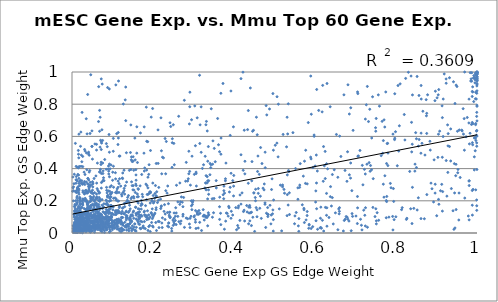
| Category | Series 0 |
|---|---|
| 0.718357 | 0.299 |
| 0.285556 | 0.323 |
| 0.155029 | 0.056 |
| 0.94191 | 0.939 |
| 0.474218 | 0.268 |
| 0.679518 | 0.098 |
| 0.994989 | 0.593 |
| 0.901487 | 0.84 |
| 0.110698 | 0.128 |
| 0.07789 | 0.343 |
| 0.333953 | 0.634 |
| 0.0120055 | 0.251 |
| 0.0165022 | 0.409 |
| 0.683924 | 0.074 |
| 0.888867 | 0.275 |
| 0.269317 | 0.074 |
| 0.150832 | 0.129 |
| 0.521332 | 0.612 |
| 0.196581 | 0.065 |
| 0.75157 | 0.076 |
| 0.637877 | 0.226 |
| 0.175998 | 0.043 |
| 0.660283 | 0.135 |
| 0.0950655 | 0.097 |
| 0.988347 | 0.264 |
| 0.483557 | 0.102 |
| 0.861981 | 0.916 |
| 0.060758 | 0.044 |
| 0.514572 | 0.297 |
| 0.0789242 | 0.045 |
| 0.996859 | 0.268 |
| 0.282066 | 0.093 |
| 0.999918 | 0.395 |
| 0.848596 | 0.623 |
| 0.0527951 | 0.046 |
| 0.337095 | 0.268 |
| 0.143686 | 0.15 |
| 0.144068 | 0.092 |
| 0.199073 | 0.773 |
| 0.549527 | 0.057 |
| 0.212938 | 0.072 |
| 0.572661 | 0.153 |
| 0.201103 | 0.186 |
| 0.313554 | 0.139 |
| 0.0573692 | 0.182 |
| 0.0279317 | 0.024 |
| 0.529778 | 0.535 |
| 0.517628 | 0.013 |
| 0.432492 | 0.131 |
| 0.0153344 | 0.055 |
| 0.625758 | 0.159 |
| 0.531065 | 0.108 |
| 0.0605387 | 0.103 |
| 0.443017 | 0.046 |
| 0.0858762 | 0.019 |
| 0.0252657 | 0.022 |
| 0.0222175 | 0.021 |
| 0.0837457 | 0.038 |
| 0.414497 | 0.078 |
| 0.423444 | 0.133 |
| 0.96833 | 0.71 |
| 0.0822502 | 0.039 |
| 0.09217 | 0.895 |
| 0.141815 | 0.137 |
| 0.234822 | 0.247 |
| 0.11498 | 0.199 |
| 0.141614 | 0.389 |
| 0.0581019 | 0.036 |
| 0.133703 | 0.035 |
| 0.0196944 | 0.014 |
| 0.0957484 | 0.202 |
| 0.0468442 | 0.026 |
| 0.0160687 | 0.489 |
| 0.0659149 | 0.909 |
| 0.181001 | 0.027 |
| 0.0706342 | 0.08 |
| 0.0345382 | 0.007 |
| 0.114906 | 0.944 |
| 0.155152 | 0.056 |
| 0.0438015 | 0.05 |
| 0.158073 | 0.121 |
| 0.0207399 | 0.11 |
| 0.109202 | 0.139 |
| 0.114537 | 0.59 |
| 0.0153444 | 0.066 |
| 0.117055 | 0.076 |
| 0.0210749 | 0.053 |
| 0.120328 | 0.291 |
| 0.343898 | 0.772 |
| 0.0160836 | 0.166 |
| 0.00742404 | 0.055 |
| 0.0233189 | 0.074 |
| 0.0383991 | 0.147 |
| 0.0199004 | 0.097 |
| 0.417271 | 0.486 |
| 0.232929 | 0.568 |
| 0.173498 | 0.24 |
| 0.0481266 | 0.221 |
| 0.116635 | 0.477 |
| 0.786092 | 0.308 |
| 0.0465272 | 0.206 |
| 0.27743 | 0.824 |
| 0.0352039 | 0.71 |
| 0.0249195 | 0.749 |
| 0.325787 | 0.111 |
| 0.951757 | 0.632 |
| 0.676875 | 0.102 |
| 0.0191285 | 0.295 |
| 0.0322849 | 0.509 |
| 0.289801 | 0.677 |
| 0.319936 | 0.016 |
| 0.0190005 | 0.04 |
| 0.236062 | 0.043 |
| 0.168207 | 0.293 |
| 0.0260575 | 0.077 |
| 0.6003 | 0.416 |
| 0.130739 | 0.04 |
| 0.314993 | 0.98 |
| 0.536633 | 0.25 |
| 0.568685 | 0.175 |
| 0.0700549 | 0.038 |
| 0.0309574 | 0.114 |
| 0.0722578 | 0.957 |
| 0.0693182 | 0.117 |
| 0.0136864 | 0.051 |
| 0.0696079 | 0.07 |
| 0.0482181 | 0.069 |
| 0.0118453 | 0.187 |
| 0.152051 | 0.136 |
| 0.167323 | 0.095 |
| 0.726782 | 0.796 |
| 0.0376793 | 0.101 |
| 0.0372241 | 0.02 |
| 0.493965 | 0.336 |
| 0.399084 | 0.291 |
| 0.145627 | 0.112 |
| 0.704594 | 0.059 |
| 0.840585 | 0.284 |
| 0.335006 | 0.045 |
| 0.0843456 | 0.396 |
| 0.604038 | 0.151 |
| 0.312608 | 0.116 |
| 0.0368721 | 0.078 |
| 0.681427 | 0.921 |
| 0.0508171 | 0.303 |
| 0.602584 | 0.076 |
| 0.0850064 | 0.099 |
| 0.705829 | 0.477 |
| 0.57118 | 0.353 |
| 0.808306 | 0.666 |
| 0.0705671 | 0.07 |
| 0.0232542 | 0.016 |
| 0.705768 | 0.866 |
| 0.597916 | 0.6 |
| 0.733568 | 0.437 |
| 0.53548 | 0.381 |
| 0.0891933 | 0.397 |
| 0.223292 | 0.094 |
| 0.580521 | 0.108 |
| 0.550494 | 0.106 |
| 0.0181383 | 0.041 |
| 0.315555 | 0.556 |
| 0.0463404 | 0.983 |
| 0.803249 | 0.418 |
| 0.0466587 | 0.296 |
| 0.364445 | 0.084 |
| 0.680432 | 0.504 |
| 0.116857 | 0.157 |
| 0.100539 | 0.378 |
| 0.128543 | 0.39 |
| 0.022665 | 0.131 |
| 0.012778 | 0.228 |
| 0.0418495 | 0.148 |
| 0.0871548 | 0.536 |
| 0.0176795 | 0.095 |
| 0.0101371 | 0.331 |
| 0.0856256 | 0.09 |
| 0.187494 | 0.28 |
| 0.0681547 | 0.251 |
| 0.0124649 | 0.052 |
| 0.969517 | 1 |
| 0.113535 | 0.55 |
| 0.0681806 | 0.632 |
| 0.178704 | 0.071 |
| 0.748192 | 0.102 |
| 0.0525424 | 0.039 |
| 0.0702964 | 0.015 |
| 0.422176 | 0.999 |
| 0.018036 | 0.011 |
| 0.0679802 | 0.378 |
| 0.101214 | 0.049 |
| 0.0896006 | 0.058 |
| 0.0225988 | 0.052 |
| 0.111407 | 0.049 |
| 0.0147012 | 0.074 |
| 0.0400479 | 0.129 |
| 0.0742723 | 0.077 |
| 0.0187522 | 0.041 |
| 0.139893 | 0.041 |
| 0.0211039 | 0.132 |
| 0.110488 | 0.064 |
| 0.094565 | 0.151 |
| 0.10492 | 0.029 |
| 0.0383495 | 0.038 |
| 0.0439104 | 0.153 |
| 0.0262996 | 0.043 |
| 0.0108756 | 0.043 |
| 0.105053 | 0.063 |
| 0.12918 | 0.119 |
| 0.0358865 | 0.09 |
| 0.033009 | 0.021 |
| 0.0545646 | 0.033 |
| 0.125645 | 0.059 |
| 0.0913621 | 0.134 |
| 0.197229 | 0.204 |
| 0.0856379 | 0.265 |
| 0.0629213 | 0.051 |
| 0.0462658 | 0.022 |
| 0.0591831 | 0.097 |
| 0.0870486 | 0.133 |
| 0.55784 | 0.209 |
| 0.198433 | 0.089 |
| 0.221934 | 0.062 |
| 0.120658 | 0.079 |
| 0.0503294 | 0.036 |
| 0.0932733 | 0.023 |
| 0.150976 | 0.473 |
| 0.166281 | 0.091 |
| 0.125929 | 0.252 |
| 0.161572 | 0.438 |
| 0.126058 | 0.048 |
| 0.0274446 | 0.073 |
| 0.0924494 | 0.428 |
| 0.411243 | 0.168 |
| 0.197301 | 0.197 |
| 0.439124 | 0.075 |
| 0.0700726 | 0.396 |
| 0.273901 | 0.105 |
| 0.30215 | 0.364 |
| 0.274168 | 0.116 |
| 0.166722 | 0.131 |
| 0.53701 | 0.115 |
| 0.923946 | 0.45 |
| 0.0377976 | 0.037 |
| 0.0284928 | 0.091 |
| 0.776772 | 0.432 |
| 0.174409 | 0.036 |
| 0.82044 | 0.736 |
| 0.0521454 | 0.035 |
| 0.167081 | 0.053 |
| 0.775905 | 0.095 |
| 0.113391 | 0.136 |
| 0.0213719 | 0.004 |
| 0.0993862 | 0.122 |
| 0.156346 | 0.252 |
| 0.999163 | 0.205 |
| 0.238074 | 0.182 |
| 0.398602 | 0.659 |
| 0.638395 | 0.288 |
| 0.825694 | 0.084 |
| 0.999379 | 0.169 |
| 0.670074 | 0.012 |
| 0.981042 | 0.324 |
| 0.480978 | 0.733 |
| 0.99989 | 0.794 |
| 0.43532 | 0.309 |
| 0.988663 | 0.111 |
| 0.193111 | 0.009 |
| 0.72301 | 0.11 |
| 0.855196 | 0.219 |
| 0.90352 | 0.47 |
| 0.756341 | 0.858 |
| 0.684908 | 0.361 |
| 0.973003 | 0.598 |
| 0.989307 | 0.548 |
| 0.585557 | 0.049 |
| 0.980014 | 0.323 |
| 0.038201 | 0.025 |
| 0.0584004 | 0.138 |
| 0.594336 | 0.039 |
| 0.133495 | 0.11 |
| 0.0330171 | 0.13 |
| 0.614403 | 0.161 |
| 0.138823 | 0.053 |
| 0.0905877 | 0.07 |
| 0.177713 | 0.496 |
| 0.857122 | 0.581 |
| 0.072196 | 0.113 |
| 0.330093 | 0.106 |
| 0.128755 | 0.262 |
| 0.0522356 | 0.074 |
| 0.0584545 | 0.083 |
| 0.457057 | 0.144 |
| 0.621135 | 0.537 |
| 0.124454 | 0.154 |
| 0.850452 | 0.407 |
| 0.18346 | 0.782 |
| 0.714606 | 0.048 |
| 0.137326 | 0.221 |
| 0.804975 | 0.916 |
| 0.506313 | 0.846 |
| 0.687748 | 0.341 |
| 0.574095 | 0.446 |
| 0.69102 | 0.263 |
| 0.309129 | 0.126 |
| 0.334107 | 0.312 |
| 0.0292313 | 0.051 |
| 0.111092 | 0.078 |
| 0.904274 | 0.858 |
| 0.292391 | 0.297 |
| 0.337602 | 0.325 |
| 0.272274 | 0.191 |
| 0.583426 | 0.686 |
| 0.71246 | 0.085 |
| 0.0591122 | 0.107 |
| 0.166717 | 0.112 |
| 0.962411 | 0.639 |
| 0.928381 | 0.541 |
| 0.425002 | 0.142 |
| 0.945716 | 0.804 |
| 0.142605 | 0.057 |
| 0.22847 | 0.176 |
| 0.0458777 | 0.066 |
| 0.297629 | 0.191 |
| 0.22016 | 0.163 |
| 0.98841 | 0.173 |
| 0.778189 | 0.556 |
| 0.387912 | 0.157 |
| 0.838799 | 0.504 |
| 0.390629 | 0.283 |
| 0.107161 | 0.374 |
| 0.242008 | 0.684 |
| 0.0221483 | 0.049 |
| 0.659693 | 0.119 |
| 0.190363 | 0.424 |
| 0.602073 | 0.261 |
| 0.337894 | 0.114 |
| 0.42534 | 0.638 |
| 0.165226 | 0.128 |
| 0.0149119 | 0.154 |
| 0.107183 | 0.137 |
| 0.336688 | 0.537 |
| 0.0666712 | 0.247 |
| 0.0319926 | 0.024 |
| 0.0930773 | 0.259 |
| 0.164657 | 0.056 |
| 0.0511316 | 0.179 |
| 0.0635012 | 0.103 |
| 0.019651 | 0.081 |
| 0.0574801 | 0.176 |
| 0.056643 | 0.026 |
| 0.0182736 | 0.079 |
| 0.426997 | 0.446 |
| 0.0480423 | 0.01 |
| 0.0317637 | 0.027 |
| 0.090616 | 0.384 |
| 0.874517 | 0.828 |
| 0.749595 | 0.654 |
| 0.152994 | 0.217 |
| 0.422767 | 0.389 |
| 0.109243 | 0.116 |
| 0.20055 | 0.233 |
| 0.124092 | 0.134 |
| 0.15244 | 0.091 |
| 0.390682 | 0.606 |
| 0.0553856 | 0.196 |
| 0.287095 | 0.337 |
| 0.148458 | 0.114 |
| 0.150987 | 0.446 |
| 0.0642308 | 0.062 |
| 0.0724478 | 0.279 |
| 0.0370698 | 0.028 |
| 0.0235357 | 0.049 |
| 0.0600038 | 0.217 |
| 0.0422625 | 0.28 |
| 0.00875941 | 0.258 |
| 0.0202835 | 0.178 |
| 0.0922949 | 0.502 |
| 0.0258915 | 0.098 |
| 0.0621678 | 0.051 |
| 0.0187486 | 0.32 |
| 0.0434104 | 0.287 |
| 0.0290432 | 0.31 |
| 0.0219038 | 0.627 |
| 0.0298475 | 0.152 |
| 0.0185486 | 0.123 |
| 0.0155305 | 0.02 |
| 0.00836883 | 0.557 |
| 0.178905 | 0.135 |
| 0.0350686 | 0.021 |
| 0.00313033 | 0.012 |
| 0.409005 | 0.047 |
| 0.99999 | 0.922 |
| 0.705156 | 0.156 |
| 0.642772 | 0.22 |
| 0.189449 | 0.364 |
| 0.948458 | 0.146 |
| 0.0229426 | 0.006 |
| 0.107544 | 0.128 |
| 0.496988 | 0.012 |
| 0.0654882 | 0.045 |
| 0.128297 | 0.02 |
| 1.0 | 0.97 |
| 0.113653 | 0.283 |
| 0.995609 | 0.511 |
| 0.0475176 | 0.074 |
| 1.0 | 0.696 |
| 0.172926 | 0.069 |
| 0.0987624 | 0.252 |
| 0.0193539 | 0.021 |
| 0.160225 | 0.082 |
| 0.0809594 | 0.036 |
| 0.004848 | 0.003 |
| 0.0260537 | 0.081 |
| 0.188661 | 0.088 |
| 0.0532216 | 0.042 |
| 0.00544776 | 0.017 |
| 0.065879 | 0.256 |
| 0.291099 | 0.875 |
| 0.00724447 | 0.06 |
| 0.0328903 | 0.023 |
| 0.013506 | 0.031 |
| 0.117464 | 0.014 |
| 0.024043 | 0.072 |
| 0.0251224 | 0.03 |
| 0.0160722 | 0.028 |
| 0.0923221 | 0.004 |
| 0.0330893 | 0.024 |
| 0.0235889 | 0.047 |
| 0.0373617 | 0.046 |
| 0.0226899 | 0.117 |
| 0.928856 | 0.617 |
| 0.0605936 | 0.551 |
| 0.0175206 | 0.241 |
| 0.100987 | 0.144 |
| 0.989866 | 0.678 |
| 0.117422 | 0.337 |
| 0.0776009 | 0.163 |
| 0.207924 | 0.432 |
| 0.492768 | 0.27 |
| 0.201311 | 0.108 |
| 0.0220259 | 0.155 |
| 0.15999 | 0.496 |
| 0.0371947 | 0.042 |
| 0.0548928 | 0.052 |
| 0.0299016 | 0.378 |
| 0.00728444 | 0.055 |
| 0.28061 | 0.322 |
| 0.10746 | 0.251 |
| 0.321984 | 0.401 |
| 0.0480868 | 0.257 |
| 0.163812 | 0.226 |
| 0.0691385 | 0.029 |
| 0.381183 | 0.124 |
| 0.168098 | 0.03 |
| 0.137462 | 0.197 |
| 0.15816 | 0.012 |
| 0.121029 | 0.006 |
| 0.0926403 | 0.037 |
| 0.0263363 | 0.302 |
| 0.0719615 | 0.44 |
| 0.108238 | 0.92 |
| 0.198015 | 0.112 |
| 0.111261 | 0.024 |
| 0.0616088 | 0.03 |
| 0.0337606 | 0.037 |
| 0.0279446 | 0.059 |
| 0.0318437 | 0.038 |
| 0.0184565 | 0.031 |
| 0.0164582 | 0.041 |
| 0.0118417 | 0.029 |
| 0.0699236 | 0.023 |
| 0.0675765 | 0.032 |
| 0.073409 | 0.03 |
| 0.0393377 | 0.338 |
| 0.0840835 | 0.07 |
| 0.0363018 | 0.152 |
| 0.0707856 | 0.115 |
| 0.0822908 | 0.092 |
| 0.041819 | 0.272 |
| 0.230094 | 0.118 |
| 0.0370766 | 0.06 |
| 0.0922987 | 0.036 |
| 0.035196 | 0.021 |
| 0.0373944 | 0.195 |
| 0.0368484 | 0.024 |
| 0.84401 | 0.153 |
| 0.0398237 | 0.122 |
| 0.968893 | 0.514 |
| 0.0921424 | 0.08 |
| 0.742144 | 0.846 |
| 0.996684 | 0.875 |
| 0.0546568 | 0.117 |
| 0.871583 | 0.484 |
| 0.157416 | 0.16 |
| 0.207528 | 0.145 |
| 0.0639192 | 0.065 |
| 0.252708 | 0.057 |
| 0.979956 | 0.684 |
| 0.855279 | 0.54 |
| 0.0570127 | 0.034 |
| 0.00614132 | 0.057 |
| 0.0956843 | 0.124 |
| 0.0189712 | 0.05 |
| 0.0120591 | 0.103 |
| 0.0452104 | 0.038 |
| 0.135016 | 0.018 |
| 0.121112 | 0.025 |
| 0.158357 | 0.088 |
| 0.153035 | 0.266 |
| 0.0337317 | 0.051 |
| 0.0230631 | 0.019 |
| 0.0618924 | 0.041 |
| 0.186018 | 0.097 |
| 0.00887429 | 0.01 |
| 0.0290007 | 0.116 |
| 0.074817 | 0.028 |
| 0.0402795 | 0.035 |
| 0.132847 | 0.187 |
| 0.206804 | 0.065 |
| 0.00645589 | 0.014 |
| 0.020534 | 0.149 |
| 0.0134809 | 0.204 |
| 0.0363262 | 0.107 |
| 0.0134591 | 0.037 |
| 0.0517626 | 0.172 |
| 0.0980891 | 0.1 |
| 0.0558845 | 0.069 |
| 0.0380486 | 0.118 |
| 0.177892 | 0.13 |
| 0.0175424 | 0.026 |
| 0.00980263 | 0.046 |
| 0.0236384 | 0.087 |
| 0.00397577 | 0.019 |
| 0.0061991 | 0.065 |
| 0.0088116 | 0.082 |
| 0.0106938 | 0.04 |
| 0.0336461 | 0.057 |
| 0.0384085 | 0.058 |
| 0.0110796 | 0.044 |
| 0.00576948 | 0.105 |
| 0.0611379 | 0.046 |
| 0.0506045 | 0.042 |
| 0.0719844 | 0.025 |
| 0.00523145 | 0.027 |
| 0.195928 | 0.122 |
| 0.0523021 | 0.055 |
| 0.0596102 | 0.093 |
| 0.0156793 | 0.513 |
| 0.277675 | 0.035 |
| 0.0288302 | 0.01 |
| 0.0270271 | 0.01 |
| 0.0978777 | 0.099 |
| 0.0683133 | 0.146 |
| 0.0459034 | 0.021 |
| 0.143415 | 0.077 |
| 0.0206203 | 0.131 |
| 0.0726655 | 0.313 |
| 0.040276 | 0.039 |
| 0.098396 | 0.077 |
| 0.367524 | 0.052 |
| 0.0108307 | 0.33 |
| 0.14672 | 0.078 |
| 0.036813 | 0.042 |
| 0.0747737 | 0.041 |
| 0.0196605 | 0.217 |
| 0.0236146 | 0.16 |
| 0.0179074 | 0.056 |
| 0.0399844 | 0.066 |
| 0.0804127 | 0.041 |
| 0.0656093 | 0.038 |
| 0.109357 | 0.135 |
| 0.0405566 | 0.105 |
| 0.0385126 | 0.023 |
| 0.054549 | 0.339 |
| 0.13465 | 0.099 |
| 0.124933 | 0.338 |
| 0.122376 | 0.24 |
| 0.43858 | 0.171 |
| 0.0901662 | 0.416 |
| 0.273947 | 0.163 |
| 0.701226 | 0.105 |
| 0.0623707 | 0.067 |
| 0.0131994 | 0.28 |
| 0.239013 | 0.062 |
| 0.0204833 | 0.176 |
| 0.105714 | 0.078 |
| 0.452602 | 0.22 |
| 0.836231 | 0.151 |
| 0.0226294 | 0.062 |
| 0.161074 | 0.196 |
| 0.305014 | 0.139 |
| 0.0387454 | 0.176 |
| 0.589547 | 0.975 |
| 0.379472 | 0.074 |
| 0.130212 | 0.164 |
| 0.737211 | 0.419 |
| 0.376612 | 0.248 |
| 0.185258 | 0.295 |
| 0.531661 | 0.361 |
| 0.141747 | 0.191 |
| 0.247636 | 0.561 |
| 0.0484678 | 0.041 |
| 0.0167652 | 0.264 |
| 0.00736248 | 0.036 |
| 0.0219418 | 0.095 |
| 0.0216522 | 0.027 |
| 0.107063 | 0.057 |
| 0.00753605 | 0.057 |
| 0.015198 | 0.288 |
| 0.0977996 | 0.112 |
| 0.0191938 | 0.055 |
| 0.0167608 | 0.467 |
| 0.0538776 | 0.07 |
| 0.0110527 | 0.065 |
| 0.0177158 | 0.13 |
| 0.0182761 | 0.046 |
| 0.0533476 | 0.098 |
| 0.0758922 | 0.065 |
| 0.0424399 | 0.378 |
| 0.0200409 | 0.184 |
| 0.0317875 | 0.302 |
| 0.0333483 | 0.115 |
| 0.00828313 | 0.02 |
| 0.0149492 | 0.135 |
| 0.0150583 | 0.034 |
| 0.173181 | 0.178 |
| 0.117179 | 0.131 |
| 0.0211326 | 0.072 |
| 0.0523996 | 0.1 |
| 0.0413371 | 0.098 |
| 0.0781463 | 0.071 |
| 0.0921525 | 0.081 |
| 0.0762764 | 0.37 |
| 0.255319 | 0.104 |
| 0.195667 | 0.126 |
| 0.0700316 | 0.118 |
| 0.0734983 | 0.107 |
| 0.443843 | 0.324 |
| 0.040067 | 0.154 |
| 0.0440704 | 0.091 |
| 0.417263 | 0.179 |
| 0.4396 | 0.159 |
| 0.0943499 | 0.01 |
| 0.0490169 | 0.09 |
| 0.242555 | 0.099 |
| 0.0724209 | 0.37 |
| 0.139368 | 0.128 |
| 0.0123547 | 0.004 |
| 0.0159963 | 0.046 |
| 0.0835936 | 0.031 |
| 0.435403 | 0.761 |
| 0.822004 | 0.578 |
| 0.0725491 | 0.116 |
| 0.00714861 | 0.177 |
| 0.625059 | 0.507 |
| 0.806792 | 0.509 |
| 0.0841138 | 0.063 |
| 0.772363 | 0.658 |
| 0.165706 | 0.148 |
| 0.0877426 | 0.098 |
| 0.729487 | 0.036 |
| 0.44319 | 0.129 |
| 0.605799 | 0.385 |
| 0.147382 | 0.014 |
| 0.290833 | 0.784 |
| 0.553632 | 0.127 |
| 0.0837369 | 0.129 |
| 0.999955 | 0.956 |
| 0.0767646 | 0.132 |
| 0.440966 | 0.126 |
| 0.383206 | 0.122 |
| 0.948501 | 0.918 |
| 0.8466 | 0.384 |
| 0.999392 | 0.981 |
| 0.351285 | 0.526 |
| 0.508885 | 0.473 |
| 0.656414 | 0.346 |
| 0.113751 | 0.323 |
| 0.0608416 | 0.181 |
| 0.102566 | 0.215 |
| 0.437339 | 0.124 |
| 0.0907006 | 0.145 |
| 0.0821823 | 0.09 |
| 0.981312 | 0.553 |
| 0.275646 | 0.221 |
| 0.87004 | 0.088 |
| 0.229894 | 0.587 |
| 0.459959 | 0.246 |
| 0.0394409 | 0.256 |
| 0.603695 | 0.311 |
| 0.585559 | 0.053 |
| 0.672236 | 0.078 |
| 0.852296 | 0.143 |
| 0.460079 | 0.276 |
| 0.308929 | 0.116 |
| 0.240093 | 0.111 |
| 0.791708 | 0.103 |
| 0.304714 | 0.542 |
| 0.0478347 | 0.036 |
| 0.0251958 | 0.115 |
| 0.0818194 | 0.12 |
| 0.0384946 | 0.248 |
| 0.0693534 | 0.533 |
| 0.186378 | 0.138 |
| 0.254967 | 0.078 |
| 0.161708 | 0.127 |
| 0.122709 | 0.121 |
| 0.0944957 | 0.223 |
| 0.145881 | 0.213 |
| 0.14868 | 0.446 |
| 0.267972 | 0.193 |
| 0.020729 | 0.056 |
| 0.111615 | 0.072 |
| 0.0359935 | 0.055 |
| 0.410549 | 0.156 |
| 0.155855 | 0.015 |
| 0.0910851 | 0.086 |
| 0.0723583 | 0.067 |
| 0.184662 | 0.108 |
| 0.0500671 | 0.061 |
| 0.0155442 | 0.044 |
| 0.00568655 | 0.015 |
| 0.0166314 | 0.058 |
| 0.0516844 | 0.102 |
| 0.140459 | 0.013 |
| 0.0900105 | 0.1 |
| 0.00886976 | 0.171 |
| 0.0305544 | 0.024 |
| 0.0997282 | 0.02 |
| 0.0255035 | 0.107 |
| 0.0947624 | 0.097 |
| 0.00941241 | 0.014 |
| 0.0484357 | 0.104 |
| 0.0515653 | 0.105 |
| 0.0720706 | 0.014 |
| 0.208628 | 0.015 |
| 0.0596119 | 0.043 |
| 0.0715147 | 0.059 |
| 0.0456764 | 0.004 |
| 0.0439256 | 0.194 |
| 0.181646 | 0.17 |
| 0.220823 | 0.511 |
| 0.0545085 | 0.155 |
| 0.00584269 | 0.023 |
| 0.34673 | 0.098 |
| 0.0432411 | 0.164 |
| 0.113214 | 0.084 |
| 0.301329 | 0.1 |
| 0.136589 | 0.093 |
| 0.240849 | 0.101 |
| 0.0207201 | 0.016 |
| 0.629493 | 0.042 |
| 0.577044 | 0.514 |
| 0.0305111 | 0.069 |
| 0.0317294 | 0.036 |
| 0.112504 | 0.126 |
| 0.0556786 | 0.005 |
| 0.0486552 | 0.037 |
| 0.285633 | 0.089 |
| 0.0605524 | 0.242 |
| 0.0866792 | 0.046 |
| 0.0412431 | 0.017 |
| 0.0292048 | 0.039 |
| 0.0134387 | 0.083 |
| 0.0895584 | 0.261 |
| 0.0186224 | 0.108 |
| 0.0185678 | 0.014 |
| 0.087383 | 0.176 |
| 0.07681 | 0.054 |
| 0.474791 | 0.305 |
| 0.0558652 | 0.148 |
| 0.348027 | 0.572 |
| 0.0655093 | 0.692 |
| 0.0109048 | 0.02 |
| 0.0610517 | 0.149 |
| 0.0175284 | 0.093 |
| 0.015022 | 0.047 |
| 0.123338 | 0.064 |
| 0.0321199 | 0.363 |
| 0.840136 | 0.551 |
| 0.0372231 | 0.616 |
| 0.297295 | 0.178 |
| 0.985498 | 0.958 |
| 0.0492996 | 0.634 |
| 0.0326106 | 0.043 |
| 0.0122548 | 0.036 |
| 0.753479 | 0.126 |
| 0.347228 | 0.427 |
| 0.0346089 | 0.064 |
| 0.0194673 | 0.198 |
| 0.0606466 | 0.515 |
| 0.0914727 | 0.612 |
| 0.361753 | 0.548 |
| 0.478232 | 0.034 |
| 0.2478 | 0.585 |
| 0.0602337 | 0.185 |
| 0.0267909 | 0.206 |
| 0.0524157 | 0.068 |
| 0.0201024 | 0.027 |
| 0.0663278 | 0.128 |
| 0.00776094 | 0.03 |
| 0.724239 | 0.366 |
| 0.0417037 | 0.056 |
| 0.102068 | 0.587 |
| 0.0210884 | 0.538 |
| 0.0424755 | 0.086 |
| 0.00957614 | 0.098 |
| 0.0176703 | 0.16 |
| 0.0255462 | 0.07 |
| 0.00970217 | 0.041 |
| 0.0073169 | 0.048 |
| 0.623191 | 0.418 |
| 0.0363983 | 0.078 |
| 0.0200321 | 0.029 |
| 0.995012 | 0.933 |
| 0.0187567 | 0.14 |
| 0.246008 | 0.028 |
| 0.086547 | 0.249 |
| 0.0316116 | 0.247 |
| 0.0723215 | 0.567 |
| 0.0442414 | 0.017 |
| 0.0354523 | 0.317 |
| 0.0629371 | 0.168 |
| 0.0243246 | 0.443 |
| 0.316341 | 0.672 |
| 0.396743 | 0.112 |
| 0.110369 | 0.617 |
| 0.0958865 | 0.083 |
| 0.0228428 | 0.101 |
| 0.0170522 | 0.068 |
| 0.0490781 | 0.073 |
| 0.0176951 | 0.123 |
| 0.0546475 | 0.079 |
| 0.0505459 | 0.266 |
| 0.00952457 | 0.022 |
| 0.0621785 | 0.214 |
| 0.115575 | 0.073 |
| 0.0306851 | 0.018 |
| 0.0123689 | 0.034 |
| 0.0494578 | 0.061 |
| 0.0100556 | 0.044 |
| 0.0592591 | 0.072 |
| 0.0802994 | 0.015 |
| 0.178592 | 0.385 |
| 0.0381937 | 0.074 |
| 0.0169559 | 0.339 |
| 0.497843 | 0.205 |
| 0.0706778 | 0.576 |
| 0.0369754 | 0.258 |
| 0.192889 | 0.098 |
| 0.0497123 | 0.061 |
| 0.0190018 | 0.026 |
| 0.0650779 | 0.093 |
| 0.0745529 | 0.057 |
| 0.0678404 | 0.1 |
| 0.0426986 | 0.047 |
| 0.0562791 | 0.093 |
| 0.336258 | 0.107 |
| 0.0485622 | 0.031 |
| 0.0340362 | 0.06 |
| 0.00972595 | 0.309 |
| 0.00354324 | 0.043 |
| 0.0270753 | 0.025 |
| 0.0294105 | 0.047 |
| 0.0194276 | 0.197 |
| 0.016204 | 0.36 |
| 0.0306093 | 0.242 |
| 0.0129704 | 0.268 |
| 0.100966 | 0.165 |
| 0.0683276 | 0.16 |
| 0.0879076 | 0.065 |
| 0.016067 | 0.05 |
| 0.0268585 | 0.174 |
| 0.00147405 | 0.259 |
| 0.144769 | 0.104 |
| 0.0944452 | 0.224 |
| 0.330856 | 0.31 |
| 0.0346889 | 0.075 |
| 0.11567 | 0.125 |
| 0.0731342 | 0.558 |
| 0.0940381 | 0.399 |
| 0.0267364 | 0.189 |
| 0.0364985 | 0.248 |
| 0.030402 | 0.056 |
| 0.029441 | 0.022 |
| 0.0886164 | 0.055 |
| 0.00786048 | 0.128 |
| 0.00217416 | 0.348 |
| 0.24227 | 0.095 |
| 0.0641771 | 0.021 |
| 0.0923118 | 0.057 |
| 0.364328 | 0.163 |
| 0.204937 | 0.245 |
| 0.603308 | 0.484 |
| 0.999436 | 0.97 |
| 0.231283 | 0.368 |
| 0.797006 | 0.588 |
| 0.694094 | 0.638 |
| 0.170954 | 0.111 |
| 0.0107525 | 0.138 |
| 0.0340786 | 0.027 |
| 0.309761 | 0.132 |
| 0.0937169 | 0.01 |
| 0.763524 | 0.48 |
| 0.0795027 | 0.039 |
| 0.952481 | 0.374 |
| 0.774771 | 0.876 |
| 0.00997594 | 0.025 |
| 0.123997 | 0.096 |
| 0.263982 | 0.071 |
| 0.0425504 | 0.029 |
| 0.905923 | 0.178 |
| 0.0667607 | 0.091 |
| 0.465685 | 0.531 |
| 0.459165 | 0.478 |
| 0.671437 | 0.858 |
| 0.155803 | 0.019 |
| 0.353658 | 0.443 |
| 0.993395 | 0.473 |
| 0.875916 | 0.743 |
| 0.214836 | 0.034 |
| 0.875838 | 0.618 |
| 0.150997 | 0.024 |
| 0.656487 | 0.02 |
| 0.336633 | 0.126 |
| 0.121668 | 0.096 |
| 0.110263 | 0.084 |
| 0.218619 | 0.21 |
| 0.93506 | 0.646 |
| 0.229851 | 0.084 |
| 0.739675 | 0.393 |
| 0.932044 | 0.964 |
| 0.50186 | 0.545 |
| 0.0525716 | 0.148 |
| 0.796977 | 0.865 |
| 0.927377 | 0.671 |
| 0.487722 | 0.77 |
| 0.00382168 | 0.263 |
| 0.0379425 | 0.183 |
| 0.00981975 | 0.254 |
| 0.0332461 | 0.119 |
| 0.164795 | 0.084 |
| 0.22724 | 0.134 |
| 0.266345 | 0.311 |
| 0.0244053 | 0.31 |
| 0.0134623 | 0.149 |
| 0.0145611 | 0.047 |
| 0.0516699 | 0.016 |
| 0.191883 | 0.255 |
| 0.509616 | 0.8 |
| 0.0549682 | 0.169 |
| 0.0151642 | 0.275 |
| 0.146373 | 0.454 |
| 0.172084 | 0.363 |
| 0.00530284 | 0.115 |
| 0.270102 | 0.224 |
| 0.0876315 | 0.223 |
| 0.0373635 | 0.052 |
| 0.00675225 | 0.086 |
| 0.0169715 | 0.031 |
| 0.00307214 | 0.028 |
| 0.36436 | 0.505 |
| 0.823834 | 0.96 |
| 0.0130872 | 0.323 |
| 0.179977 | 0.109 |
| 0.0163829 | 0.091 |
| 0.0514596 | 0.207 |
| 0.00805303 | 0.127 |
| 0.0876541 | 0.229 |
| 0.0879437 | 0.903 |
| 0.0473121 | 0.173 |
| 0.0184987 | 0.077 |
| 0.0234395 | 0.092 |
| 0.0916758 | 0.126 |
| 0.068776 | 0.048 |
| 0.0269063 | 0.262 |
| 0.0695563 | 0.719 |
| 0.0227607 | 0.125 |
| 0.102642 | 0.284 |
| 0.0306235 | 0.121 |
| 0.00573101 | 0.365 |
| 0.0222389 | 0.069 |
| 0.0384934 | 0.168 |
| 0.014725 | 0.078 |
| 0.0252397 | 0.102 |
| 0.163496 | 0.186 |
| 0.0887462 | 0.234 |
| 0.0771687 | 0.327 |
| 0.220662 | 0.168 |
| 0.944123 | 0.431 |
| 0.266201 | 0.178 |
| 0.999999 | 0.987 |
| 0.200199 | 0.1 |
| 0.12901 | 0.183 |
| 0.33488 | 0.212 |
| 0.380141 | 0.434 |
| 0.23154 | 0.263 |
| 0.523461 | 0.271 |
| 0.12113 | 0.072 |
| 0.294924 | 0.169 |
| 0.0788621 | 0.182 |
| 1.0 | 0.993 |
| 0.6881 | 0.435 |
| 0.7688 | 0.574 |
| 0.146905 | 0.473 |
| 0.965792 | 0.772 |
| 0.999938 | 0.995 |
| 0.0493127 | 0.538 |
| 0.0474831 | 0.17 |
| 0.916595 | 0.832 |
| 0.999974 | 0.995 |
| 0.0265708 | 0.412 |
| 0.0680738 | 0.104 |
| 0.0147596 | 0.113 |
| 0.0319983 | 0.047 |
| 0.0103029 | 0.414 |
| 0.0300168 | 0.03 |
| 0.0981144 | 0.06 |
| 0.0550307 | 0.056 |
| 0.0430773 | 0.155 |
| 0.158263 | 0.328 |
| 0.13044 | 0.066 |
| 0.0964236 | 0.243 |
| 0.0213294 | 0.03 |
| 0.0283656 | 0.028 |
| 0.0930599 | 0.216 |
| 0.0367 | 0.053 |
| 0.0295823 | 0.12 |
| 0.14529 | 0.671 |
| 0.123173 | 0.23 |
| 0.109269 | 0.211 |
| 0.205991 | 0.295 |
| 0.866384 | 0.756 |
| 0.0213966 | 0.058 |
| 0.0194272 | 0.03 |
| 0.0419639 | 0.045 |
| 0.373272 | 0.238 |
| 0.0266915 | 0.101 |
| 0.077746 | 0.032 |
| 0.190044 | 0.087 |
| 0.0261322 | 0.002 |
| 0.815375 | 0.157 |
| 0.00331565 | 0.009 |
| 0.0843224 | 0.204 |
| 0.251904 | 0.091 |
| 0.449038 | 0.249 |
| 0.0693692 | 0.383 |
| 0.169699 | 0.073 |
| 0.177354 | 0.031 |
| 0.0330175 | 0.263 |
| 0.189418 | 0.112 |
| 0.419877 | 0.249 |
| 0.770514 | 0.703 |
| 0.560215 | 0.089 |
| 0.562053 | 0.284 |
| 0.980589 | 0.081 |
| 0.0963983 | 0.422 |
| 0.158036 | 0.361 |
| 0.13428 | 0.499 |
| 0.214256 | 0.283 |
| 0.103545 | 0.115 |
| 0.0450109 | 0.227 |
| 0.0419051 | 0.02 |
| 0.0336009 | 0.064 |
| 0.0496819 | 0.246 |
| 0.0300428 | 0.035 |
| 0.0164161 | 0.018 |
| 0.0884677 | 0.138 |
| 0.359596 | 0.711 |
| 0.0292047 | 0.033 |
| 0.0836177 | 0.18 |
| 0.779936 | 0.419 |
| 0.0486095 | 0.014 |
| 0.00764136 | 0.155 |
| 0.0214587 | 0.093 |
| 0.0156282 | 0.039 |
| 0.133659 | 0.094 |
| 0.0111115 | 0.037 |
| 0.19881 | 0.043 |
| 0.0237001 | 0.068 |
| 0.0315813 | 0.072 |
| 0.0547503 | 0.047 |
| 0.0191619 | 0.033 |
| 0.0113247 | 0.068 |
| 0.063166 | 0.073 |
| 0.0172965 | 0.057 |
| 0.0988252 | 0.038 |
| 0.0239343 | 0.087 |
| 0.124235 | 0.021 |
| 0.0190594 | 0.131 |
| 0.0397676 | 0.021 |
| 0.15764 | 0.393 |
| 0.0856734 | 0.078 |
| 0.144308 | 0.5 |
| 0.86416 | 0.557 |
| 0.47661 | 0.187 |
| 0.856778 | 0.854 |
| 0.613446 | 0.092 |
| 0.606406 | 0.023 |
| 0.614128 | 0.034 |
| 0.0305391 | 0.027 |
| 0.993298 | 0.392 |
| 0.896564 | 0.248 |
| 0.467444 | 0.091 |
| 0.311637 | 0.031 |
| 0.00929028 | 0.013 |
| 0.913798 | 0.79 |
| 0.840641 | 0.858 |
| 0.326563 | 0.08 |
| 0.839545 | 0.059 |
| 0.238809 | 0.038 |
| 0.323921 | 0.104 |
| 0.282134 | 0.439 |
| 0.120966 | 0.055 |
| 0.945661 | 0.031 |
| 0.0621405 | 0.276 |
| 0.663962 | 0.475 |
| 0.0214052 | 0.048 |
| 0.202946 | 0.194 |
| 0.105984 | 0.034 |
| 0.115151 | 0.086 |
| 0.609106 | 0.761 |
| 0.707182 | 0.479 |
| 0.45338 | 0.272 |
| 0.8762 | 0.239 |
| 0.830588 | 0.998 |
| 0.897254 | 0.881 |
| 0.106284 | 0.218 |
| 0.743749 | 0.337 |
| 0.735226 | 0.769 |
| 0.219662 | 0.715 |
| 0.83386 | 0.382 |
| 0.894073 | 0.454 |
| 0.999999 | 0.987 |
| 0.128019 | 0.121 |
| 0.928007 | 0.376 |
| 0.980375 | 0.832 |
| 0.0820368 | 0.09 |
| 0.00543248 | 0.098 |
| 0.0664612 | 0.047 |
| 0.0327641 | 0.098 |
| 0.136793 | 0.043 |
| 0.914361 | 0.47 |
| 0.0461203 | 0.065 |
| 0.886429 | 0.31 |
| 0.625318 | 0.338 |
| 0.012294 | 0.051 |
| 0.0640753 | 0.121 |
| 0.0610093 | 0.218 |
| 0.00841893 | 0.031 |
| 0.955162 | 0.081 |
| 0.0281276 | 0.068 |
| 0.742955 | 0.159 |
| 0.904872 | 0.614 |
| 0.296385 | 0.477 |
| 0.315288 | 0.066 |
| 0.376317 | 0.024 |
| 0.999433 | 0.749 |
| 0.688302 | 0.778 |
| 0.133359 | 0.047 |
| 0.862333 | 0.832 |
| 0.323949 | 0.145 |
| 0.573813 | 0.065 |
| 0.0959639 | 0.225 |
| 0.787802 | 0.281 |
| 0.0990582 | 0.046 |
| 0.399482 | 0.357 |
| 0.999498 | 0.964 |
| 0.398909 | 0.23 |
| 0.724347 | 0.044 |
| 0.991882 | 0.816 |
| 0.905617 | 0.891 |
| 0.126406 | 0.157 |
| 0.69271 | 0.103 |
| 0.488953 | 0.172 |
| 0.892766 | 0.193 |
| 0.999896 | 0.948 |
| 0.261371 | 0.193 |
| 0.999394 | 0.141 |
| 0.932079 | 0.537 |
| 0.261389 | 0.103 |
| 0.113387 | 0.04 |
| 0.850412 | 0.585 |
| 0.612798 | 0.032 |
| 0.303218 | 0.789 |
| 0.465089 | 0.229 |
| 0.0183128 | 0.037 |
| 0.480244 | 0.123 |
| 0.101868 | 0.045 |
| 0.222723 | 0.034 |
| 0.101898 | 0.508 |
| 0.0334851 | 0.05 |
| 0.174602 | 0.225 |
| 0.125286 | 0.373 |
| 0.74007 | 0.59 |
| 0.71105 | 0.513 |
| 0.0937444 | 0.285 |
| 0.426847 | 0.367 |
| 0.0493229 | 0.537 |
| 0.0518858 | 0.31 |
| 0.37502 | 0.263 |
| 0.0757783 | 0.434 |
| 0.172511 | 0.104 |
| 0.0371887 | 0.014 |
| 0.306511 | 0.369 |
| 0.134004 | 0.081 |
| 0.115268 | 0.063 |
| 0.0300962 | 0.127 |
| 0.208149 | 0.23 |
| 0.326907 | 0.106 |
| 0.13611 | 0.106 |
| 0.852117 | 0.972 |
| 0.187548 | 0.347 |
| 0.042193 | 0.084 |
| 0.045341 | 0.117 |
| 0.0588306 | 0.091 |
| 0.0684659 | 0.196 |
| 0.318845 | 0.783 |
| 0.629328 | 0.157 |
| 0.617644 | 0.752 |
| 0.0178212 | 0.043 |
| 0.0128493 | 0.054 |
| 0.087372 | 0.102 |
| 0.66098 | 0.602 |
| 0.476854 | 0.502 |
| 0.111461 | 0.274 |
| 0.0132372 | 0.01 |
| 0.148941 | 0.044 |
| 0.0354304 | 0.205 |
| 0.342623 | 0.406 |
| 0.0128216 | 0.004 |
| 0.457375 | 0.61 |
| 0.161417 | 0.242 |
| 0.0826615 | 0.052 |
| 0.011322 | 0.044 |
| 0.16321 | 0.275 |
| 0.331101 | 0.356 |
| 0.0741868 | 0.207 |
| 0.109064 | 0.079 |
| 0.0347318 | 0.266 |
| 0.750234 | 0.15 |
| 0.392614 | 0.091 |
| 0.0568967 | 0.113 |
| 0.333922 | 0.35 |
| 0.0177221 | 0.08 |
| 0.0308496 | 0.204 |
| 0.0176777 | 0.019 |
| 0.584541 | 0.029 |
| 0.0106893 | 0.03 |
| 0.0106593 | 0.049 |
| 0.120431 | 0.074 |
| 0.00956204 | 0.095 |
| 0.0326307 | 0.074 |
| 0.590342 | 0.46 |
| 0.0296961 | 0.204 |
| 0.471712 | 0.278 |
| 0.0177697 | 0.043 |
| 0.0339905 | 0.069 |
| 0.0145105 | 0.069 |
| 0.0174702 | 0.04 |
| 0.0276852 | 0.064 |
| 0.187676 | 0.016 |
| 0.0360591 | 0.044 |
| 0.267752 | 0.058 |
| 0.0766776 | 0.026 |
| 0.0133525 | 0.087 |
| 0.00922388 | 0.044 |
| 0.0354702 | 0.07 |
| 0.0148727 | 0.044 |
| 0.00953768 | 0.045 |
| 0.060122 | 0.067 |
| 0.0807598 | 0.456 |
| 0.01266 | 0.033 |
| 0.0260722 | 0.18 |
| 0.10318 | 0.074 |
| 0.48309 | 0.115 |
| 0.00899029 | 0.129 |
| 0.0611975 | 0.168 |
| 0.304891 | 0.067 |
| 0.131634 | 0.293 |
| 0.776932 | 0.195 |
| 0.645109 | 0.056 |
| 0.0197087 | 0.036 |
| 0.0601595 | 0.04 |
| 0.0495112 | 0.093 |
| 0.0355436 | 0.147 |
| 0.0102292 | 0.032 |
| 0.186993 | 0.567 |
| 0.0793295 | 0.097 |
| 0.0937992 | 0.04 |
| 0.476559 | 0.178 |
| 0.0769042 | 0.021 |
| 0.0371454 | 0.111 |
| 0.021696 | 0.017 |
| 0.0312612 | 0.055 |
| 0.030651 | 0.044 |
| 0.58082 | 0.305 |
| 0.794325 | 0.196 |
| 0.0609468 | 0.31 |
| 0.0198247 | 0.112 |
| 0.189591 | 0.04 |
| 0.0209704 | 0.104 |
| 0.0124501 | 0.085 |
| 0.647504 | 0.393 |
| 0.71684 | 0.42 |
| 0.0270547 | 0.02 |
| 0.050304 | 0.068 |
| 0.925684 | 0.229 |
| 0.0502598 | 0.063 |
| 0.0745005 | 0.093 |
| 0.0923093 | 0.125 |
| 0.0599881 | 0.089 |
| 0.0149945 | 0.053 |
| 0.0189023 | 0.028 |
| 0.107643 | 0.115 |
| 0.171021 | 0.148 |
| 0.0627046 | 0.107 |
| 0.011899 | 0.053 |
| 0.0127041 | 0.048 |
| 0.0175212 | 0.039 |
| 0.00436368 | 0.031 |
| 0.131472 | 0.827 |
| 0.590912 | 0.738 |
| 0.14706 | 0.318 |
| 0.0752364 | 0.152 |
| 0.140068 | 0.026 |
| 0.0339301 | 0.066 |
| 0.750055 | 0.632 |
| 0.113925 | 0.141 |
| 0.0626181 | 0.08 |
| 0.142259 | 0.094 |
| 0.330517 | 0.097 |
| 0.0707448 | 0.058 |
| 0.069872 | 0.081 |
| 0.999874 | 0.986 |
| 0.94305 | 0.023 |
| 0.792459 | 0.019 |
| 0.225855 | 0.467 |
| 0.0192566 | 0.036 |
| 0.705091 | 0.876 |
| 0.496016 | 0.143 |
| 0.969853 | 0.217 |
| 0.994723 | 0.962 |
| 0.148928 | 0.444 |
| 0.134827 | 0.317 |
| 0.0311238 | 0.519 |
| 0.156021 | 0.454 |
| 0.304738 | 0.083 |
| 0.023822 | 0.119 |
| 0.184629 | 0.083 |
| 0.0463647 | 0.197 |
| 0.125411 | 0.023 |
| 0.396986 | 0.325 |
| 0.947389 | 0.356 |
| 0.306386 | 0.378 |
| 0.0381394 | 0.084 |
| 0.100273 | 0.327 |
| 0.257386 | 0.124 |
| 0.557742 | 0.28 |
| 0.0600798 | 0.049 |
| 0.631078 | 0.399 |
| 0.732095 | 0.692 |
| 0.995502 | 0.951 |
| 0.768707 | 0.303 |
| 0.0513378 | 0.286 |
| 0.0229951 | 0.055 |
| 0.720276 | 0.142 |
| 0.291509 | 0.091 |
| 0.169223 | 0.106 |
| 0.0375097 | 0.026 |
| 0.7773 | 0.227 |
| 0.770345 | 0.223 |
| 0.0772222 | 0.057 |
| 0.0309198 | 0.064 |
| 0.073915 | 0.048 |
| 0.0891644 | 0.171 |
| 0.915245 | 0.257 |
| 0.0672661 | 0.104 |
| 0.799702 | 0.101 |
| 0.999999 | 0.883 |
| 0.291412 | 0.034 |
| 0.153109 | 0.036 |
| 0.150487 | 0.268 |
| 0.0530479 | 0.027 |
| 0.158464 | 0.11 |
| 0.0505772 | 0.319 |
| 0.780244 | 0.496 |
| 0.0111953 | 0.261 |
| 0.0266972 | 0.211 |
| 0.0397381 | 0.092 |
| 0.0558205 | 0.251 |
| 0.0449069 | 0.146 |
| 0.00327585 | 0.199 |
| 0.99352 | 0.59 |
| 0.386951 | 0.165 |
| 0.0504786 | 0.459 |
| 0.013127 | 0.189 |
| 0.152469 | 0.39 |
| 0.445851 | 0.632 |
| 0.293795 | 0.104 |
| 0.0440966 | 0.033 |
| 0.37281 | 0.929 |
| 0.956411 | 0.64 |
| 0.149703 | 0.107 |
| 0.163472 | 0.15 |
| 0.132705 | 0.698 |
| 0.837204 | 0.975 |
| 0.604178 | 0.891 |
| 0.114278 | 0.624 |
| 0.257174 | 0.052 |
| 0.160117 | 0.659 |
| 0.00844793 | 0.071 |
| 0.184488 | 0.57 |
| 0.00692626 | 0.039 |
| 0.158621 | 0.294 |
| 0.356338 | 0.28 |
| 0.826926 | 0.091 |
| 0.909929 | 0.262 |
| 0.0131028 | 0.034 |
| 0.019916 | 0.028 |
| 0.0423067 | 0.077 |
| 0.00962776 | 0.043 |
| 0.0243319 | 0.084 |
| 0.00920107 | 0.025 |
| 0.0412011 | 0.031 |
| 0.133205 | 0.131 |
| 0.0386686 | 0.305 |
| 0.100188 | 0.069 |
| 0.0255645 | 0.014 |
| 0.0401591 | 0.187 |
| 0.074973 | 0.32 |
| 0.085278 | 0.284 |
| 0.0434472 | 0.009 |
| 0.18337 | 0.098 |
| 0.779356 | 0.557 |
| 0.0465833 | 0.035 |
| 0.562379 | 0.298 |
| 0.204242 | 0.216 |
| 0.296046 | 0.145 |
| 0.914552 | 0.136 |
| 0.113171 | 0.06 |
| 0.0342605 | 0.133 |
| 0.936721 | 0.276 |
| 0.519992 | 0.298 |
| 0.955684 | 0.248 |
| 0.449135 | 0.248 |
| 0.589267 | 0.471 |
| 0.980662 | 0.295 |
| 0.329727 | 0.311 |
| 0.258015 | 0.296 |
| 0.999995 | 0.998 |
| 0.200431 | 0.037 |
| 0.0351075 | 0.064 |
| 0.059905 | 0.15 |
| 0.87513 | 0.728 |
| 1.0 | 0.997 |
| 0.78256 | 0.099 |
| 0.999992 | 0.999 |
| 0.368086 | 0.59 |
| 0.724714 | 0.157 |
| 0.0259443 | 0.07 |
| 0.684818 | 0.739 |
| 0.992153 | 0.978 |
| 0.907847 | 0.632 |
| 0.999964 | 0.963 |
| 0.999998 | 0.998 |
| 0.883781 | 0.57 |
| 0.989276 | 0.908 |
| 0.999992 | 0.999 |
| 0.99099 | 0.962 |
| 0.993432 | 0.966 |
| 0.940785 | 0.138 |
| 0.436536 | 0.161 |
| 0.847027 | 0.428 |
| 0.999458 | 0.539 |
| 1.0 | 1 |
| 0.983253 | 0.996 |
| 0.534634 | 0.388 |
| 0.999467 | 0.637 |
| 0.414872 | 0.236 |
| 0.990203 | 0.271 |
| 0.999978 | 0.787 |
| 0.996348 | 0.59 |
| 0.776088 | 0.202 |
| 0.916355 | 0.599 |
| 0.759168 | 0.788 |
| 0.997301 | 0.957 |
| 0.999431 | 0.868 |
| 0.98449 | 0.944 |
| 0.914533 | 0.717 |
| 0.966601 | 0.614 |
| 0.98859 | 0.561 |
| 0.999979 | 0.961 |
| 1.0 | 0.956 |
| 0.650394 | 0.125 |
| 1.0 | 0.998 |
| 0.0393145 | 0.12 |
| 0.551951 | 0.4 |
| 0.0243744 | 0.158 |
| 0.0739171 | 0.641 |
| 0.117004 | 0.026 |
| 0.628473 | 0.11 |
| 0.999987 | 0.996 |
| 0.861995 | 0.62 |
| 0.0023692 | 0.281 |
| 0.0968999 | 0.086 |
| 0.704827 | 0.227 |
| 0.21904 | 0.152 |
| 0.124248 | 0.341 |
| 0.0574916 | 0.019 |
| 0.17948 | 0.114 |
| 0.0413368 | 0.33 |
| 0.238686 | 0.061 |
| 0.318994 | 0.501 |
| 0.463719 | 0.154 |
| 0.190822 | 0.247 |
| 0.045879 | 0.117 |
| 0.55894 | 0.044 |
| 0.213496 | 0.204 |
| 0.0530609 | 0.132 |
| 0.86155 | 0.496 |
| 0.0654796 | 0.201 |
| 0.102895 | 0.044 |
| 0.0278697 | 0.051 |
| 0.247036 | 0.408 |
| 0.62971 | 0.929 |
| 0.689407 | 0.014 |
| 0.0193748 | 0.029 |
| 0.0741737 | 0.173 |
| 0.0245428 | 0.096 |
| 0.00882137 | 0.003 |
| 0.404453 | 0.158 |
| 0.0548421 | 0.047 |
| 0.100479 | 0.032 |
| 0.0197263 | 0.034 |
| 0.077435 | 0.054 |
| 0.0947477 | 0.241 |
| 0.0394882 | 0.042 |
| 0.241556 | 0.13 |
| 0.0803702 | 0.084 |
| 0.184216 | 0.391 |
| 0.0684888 | 0.094 |
| 0.0220403 | 0.084 |
| 0.10763 | 0.336 |
| 0.0520687 | 0.097 |
| 0.0260133 | 0.12 |
| 0.0563346 | 0.203 |
| 0.0622426 | 0.081 |
| 0.0940921 | 0.221 |
| 0.141664 | 0.084 |
| 0.13418 | 0.135 |
| 0.0864496 | 0.185 |
| 0.328167 | 0.28 |
| 0.0765586 | 0.099 |
| 0.60153 | 0.192 |
| 0.0137602 | 0.279 |
| 0.678913 | 0.321 |
| 0.12876 | 0.277 |
| 0.3374 | 0.24 |
| 0.162699 | 0.071 |
| 0.0980294 | 0.063 |
| 0.203304 | 0.116 |
| 0.0851326 | 0.102 |
| 0.0200464 | 0.082 |
| 0.393411 | 0.135 |
| 0.388685 | 0.255 |
| 0.198158 | 0.15 |
| 0.136487 | 0.053 |
| 0.658569 | 0.15 |
| 0.252096 | 0.124 |
| 0.64291 | 0.363 |
| 0.0356956 | 0.132 |
| 0.793533 | 0.276 |
| 0.795351 | 0.083 |
| 0.491151 | 0.057 |
| 0.0226975 | 0.053 |
| 0.988198 | 0.848 |
| 0.289951 | 0.056 |
| 0.148607 | 0.294 |
| 0.0741219 | 0.006 |
| 0.0877585 | 0.032 |
| 0.0803597 | 0.003 |
| 0.560005 | 0.01 |
| 0.497162 | 0.083 |
| 0.0125631 | 0.036 |
| 0.0212754 | 0.05 |
| 0.124629 | 0.054 |
| 0.0080583 | 0.033 |
| 0.450942 | 0.01 |
| 0.246451 | 0.012 |
| 0.0847418 | 0.031 |
| 0.426286 | 0.075 |
| 0.119 | 0.068 |
| 0.0689015 | 0.21 |
| 0.0851591 | 0.023 |
| 0.142162 | 0.172 |
| 0.147683 | 0.222 |
| 0.0289584 | 0.069 |
| 0.0450513 | 0.315 |
| 0.155199 | 0.589 |
| 0.0728101 | 0.093 |
| 0.151233 | 0.294 |
| 0.0510655 | 0.138 |
| 0.211039 | 0.189 |
| 0.9968 | 0.68 |
| 0.160959 | 0.224 |
| 0.495123 | 0.119 |
| 0.98633 | 0.674 |
| 0.0350481 | 0.056 |
| 0.838341 | 0.687 |
| 0.95844 | 0.345 |
| 0.14382 | 0.061 |
| 0.0920523 | 0.197 |
| 0.33334 | 0.096 |
| 0.122164 | 0.031 |
| 0.00898889 | 0.04 |
| 0.249091 | 0.08 |
| 0.59045 | 0.028 |
| 0.431345 | 0.171 |
| 0.306179 | 0.028 |
| 0.185659 | 0.239 |
| 0.215561 | 0.071 |
| 0.975951 | 0.718 |
| 0.545534 | 0.623 |
| 0.411122 | 0.032 |
| 0.716015 | 0.019 |
| 0.0915619 | 0.098 |
| 0.256059 | 0.157 |
| 0.33067 | 0.672 |
| 0.998808 | 0.633 |
| 0.519916 | 0.287 |
| 0.163726 | 0.271 |
| 0.105254 | 0.055 |
| 0.121838 | 0.12 |
| 0.385674 | 0.105 |
| 0.0197494 | 0.019 |
| 0.290507 | 0.382 |
| 0.0882738 | 0.077 |
| 0.406341 | 0.02 |
| 0.331138 | 0.268 |
| 0.316128 | 0.122 |
| 0.378754 | 0.324 |
| 0.691504 | 0.121 |
| 0.505994 | 0.558 |
| 0.144624 | 0.031 |
| 0.288449 | 0.368 |
| 0.0614144 | 0.103 |
| 0.919089 | 0.988 |
| 0.193041 | 0.186 |
| 0.294627 | 0.2 |
| 0.0746155 | 0.925 |
| 0.491856 | 0.111 |
| 0.469099 | 0.431 |
| 0.05809 | 0.041 |
| 0.0282808 | 0.052 |
| 0.652899 | 0.612 |
| 0.139372 | 0.233 |
| 0.0422805 | 0.017 |
| 0.367609 | 0.868 |
| 0.0190779 | 0.221 |
| 0.1936 | 0.25 |
| 0.148379 | 0.027 |
| 0.100028 | 0.066 |
| 0.0435973 | 0.111 |
| 0.0762122 | 0.157 |
| 0.0247606 | 0.02 |
| 0.236412 | 0.292 |
| 0.0987665 | 0.034 |
| 0.0902571 | 0.12 |
| 0.0962512 | 0.086 |
| 0.00428952 | 0.048 |
| 0.0656497 | 0.104 |
| 0.00305447 | 0.045 |
| 0.0269453 | 0.253 |
| 0.00588332 | 0.136 |
| 0.0103038 | 0.016 |
| 0.374582 | 0.213 |
| 0.029594 | 0.022 |
| 0.158854 | 0.035 |
| 0.097693 | 0.045 |
| 0.0428243 | 0.038 |
| 0.00768589 | 0.046 |
| 0.0560589 | 0.061 |
| 0.0231935 | 0.051 |
| 0.0204415 | 0.068 |
| 0.116023 | 0.252 |
| 0.349524 | 0.126 |
| 0.208044 | 0.228 |
| 0.75722 | 0.079 |
| 0.212361 | 0.64 |
| 0.164271 | 0.101 |
| 0.25153 | 0.556 |
| 0.147431 | 0.07 |
| 0.0516695 | 0.076 |
| 0.0699926 | 0.083 |
| 0.0594754 | 0.048 |
| 0.195603 | 0.72 |
| 0.456818 | 0.101 |
| 0.032586 | 0.092 |
| 0.0423322 | 0.046 |
| 0.0335523 | 0.019 |
| 0.935046 | 0.447 |
| 0.988296 | 0.879 |
| 0.674173 | 0.389 |
| 0.950518 | 0.91 |
| 0.674799 | 0.086 |
| 0.095645 | 0.042 |
| 0.722024 | 0.395 |
| 0.813764 | 0.145 |
| 0.997254 | 0.575 |
| 0.531653 | 0.239 |
| 0.117316 | 0.166 |
| 0.0899062 | 0.173 |
| 0.0130087 | 0.11 |
| 0.328859 | 0.476 |
| 0.110804 | 0.068 |
| 0.963359 | 0.634 |
| 0.878038 | 0.858 |
| 0.999964 | 0.999 |
| 0.615835 | 0.03 |
| 0.987154 | 0.996 |
| 0.171877 | 0.183 |
| 0.116182 | 0.127 |
| 0.483035 | 0.158 |
| 0.900513 | 0.107 |
| 0.999752 | 0.992 |
| 0.923759 | 0.957 |
| 0.729231 | 0.91 |
| 0.249954 | 0.047 |
| 0.99999 | 0.602 |
| 0.999929 | 0.929 |
| 0.619004 | 0.917 |
| 0.996596 | 0.985 |
| 0.235779 | 0.128 |
| 0.0722696 | 0.518 |
| 0.999702 | 0.913 |
| 0.660512 | 0.157 |
| 0.896791 | 0.303 |
| 0.99606 | 0.993 |
| 1.0 | 1 |
| 0.998339 | 0.832 |
| 0.999285 | 0.56 |
| 0.997332 | 0.981 |
| 0.996545 | 0.673 |
| 0.681154 | 0.085 |
| 0.767111 | 0.495 |
| 0.533994 | 0.802 |
| 0.0964705 | 0.171 |
| 0.772539 | 0.355 |
| 0.497279 | 0.514 |
| 0.331921 | 0.693 |
| 0.207772 | 0.157 |
| 0.999989 | 0.943 |
| 0.999999 | 0.989 |
| 0.0084949 | 0.026 |
| 0.0243498 | 0.325 |
| 0.572885 | 0.144 |
| 0.0409478 | 0.289 |
| 0.45474 | 0.158 |
| 0.0188854 | 0.214 |
| 0.0525844 | 0.245 |
| 0.0132811 | 0.059 |
| 0.479361 | 0.791 |
| 0.637473 | 0.784 |
| 0.0527869 | 0.218 |
| 0.163816 | 0.068 |
| 0.0640716 | 0.264 |
| 0.343036 | 0.424 |
| 0.0185113 | 0.019 |
| 0.00364311 | 0.287 |
| 0.2127 | 0.432 |
| 0.989444 | 0.876 |
| 1.0 | 0.997 |
| 0.999984 | 0.95 |
| 0.628578 | 0.43 |
| 0.141169 | 0.055 |
| 0.0122061 | 0.004 |
| 0.62848 | 0.246 |
| 0.999998 | 0.949 |
| 0.102236 | 0.415 |
| 0.63452 | 0.096 |
| 0.0220537 | 0.027 |
| 0.0303041 | 0.087 |
| 0.0274181 | 0.048 |
| 0.25263 | 0.424 |
| 0.948207 | 0.427 |
| 0.751447 | 0.057 |
| 0.904977 | 0.209 |
| 0.0707763 | 0.053 |
| 0.299094 | 0.201 |
| 0.124299 | 0.014 |
| 0.57803 | 0.081 |
| 0.309117 | 0.715 |
| 0.28855 | 0.508 |
| 0.0758322 | 0.088 |
| 0.594897 | 0.406 |
| 0.0661176 | 0.109 |
| 0.125002 | 0.096 |
| 0.621458 | 0.012 |
| 0.136683 | 0.203 |
| 0.0742201 | 0.072 |
| 0.580785 | 0.133 |
| 0.751109 | 0.711 |
| 0.576531 | 0.308 |
| 0.0877255 | 0.053 |
| 0.0214506 | 0.12 |
| 0.531167 | 0.719 |
| 0.618271 | 0.079 |
| 0.0381046 | 0.103 |
| 0.392761 | 0.371 |
| 0.597793 | 0.609 |
| 0.346177 | 0.213 |
| 0.88466 | 0.515 |
| 0.998934 | 0.607 |
| 0.375236 | 0.291 |
| 0.524688 | 0.247 |
| 0.446545 | 0.098 |
| 0.944688 | 0.249 |
| 0.978563 | 0.105 |
| 0.98287 | 0.619 |
| 0.0589661 | 0.125 |
| 0.021768 | 0.031 |
| 0.0627515 | 0.434 |
| 0.0334076 | 0.146 |
| 0.0102006 | 0.254 |
| 0.0232065 | 0.484 |
| 0.013197 | 0.408 |
| 0.00556849 | 0.165 |
| 0.0312129 | 0.25 |
| 0.0468125 | 0.158 |
| 0.0226024 | 0.07 |
| 0.0169367 | 0.308 |
| 0.0410011 | 0.502 |
| 0.0392662 | 0.339 |
| 0.0854949 | 0.2 |
| 0.0090438 | 0.053 |
| 0.0171721 | 0.273 |
| 0.0357056 | 0.497 |
| 0.0377463 | 0.18 |
| 0.109047 | 0.204 |
| 0.0125514 | 0.044 |
| 0.0645226 | 0.032 |
| 0.110204 | 0.048 |
| 0.169824 | 0.026 |
| 0.104266 | 0.049 |
| 0.0192035 | 0.005 |
| 0.0344208 | 0.073 |
| 0.0108983 | 0.058 |
| 0.0455172 | 0.075 |
| 0.0158442 | 0.034 |
| 0.047303 | 0.125 |
| 0.182588 | 0.304 |
| 0.0143958 | 0.364 |
| 0.0119162 | 0.218 |
| 0.0264693 | 0.476 |
| 0.016213 | 0.092 |
| 0.0207121 | 0.327 |
| 0.0293214 | 0.031 |
| 0.0326069 | 0.215 |
| 0.0429485 | 0.262 |
| 0.0158706 | 0.405 |
| 0.0624386 | 0.043 |
| 0.033196 | 0.2 |
| 0.0365961 | 0.393 |
| 0.25132 | 0.069 |
| 0.163036 | 0.118 |
| 0.0970382 | 0.294 |
| 0.130057 | 0.242 |
| 0.953108 | 0.395 |
| 0.0959335 | 0.161 |
| 0.087713 | 0.141 |
| 0.0685606 | 0.049 |
| 0.640539 | 0.168 |
| 0.0333903 | 0.066 |
| 0.193811 | 0.512 |
| 0.0650027 | 0.066 |
| 0.183963 | 0.206 |
| 0.307129 | 0.292 |
| 0.511869 | 0.15 |
| 0.191881 | 0.047 |
| 0.0119746 | 0.179 |
| 0.111044 | 0.065 |
| 0.302262 | 0.106 |
| 0.068113 | 0.762 |
| 0.0172277 | 0.125 |
| 0.0463475 | 0.252 |
| 0.366888 | 0.122 |
| 0.0586054 | 0.024 |
| 0.0394279 | 0.155 |
| 0.0212619 | 0.156 |
| 0.209226 | 0.256 |
| 0.444449 | 0.443 |
| 0.350746 | 0.214 |
| 0.193665 | 0.256 |
| 0.221569 | 0.368 |
| 0.01046 | 0.12 |
| 0.093282 | 0.147 |
| 0.0864668 | 0.128 |
| 0.1017 | 0.161 |
| 0.1356 | 0.192 |
| 0.0197721 | 0.212 |
| 0.00765144 | 0.142 |
| 0.462388 | 0.364 |
| 0.0251913 | 0.181 |
| 0.0907928 | 0.044 |
| 0.0170146 | 0.051 |
| 0.0961076 | 0.17 |
| 0.110348 | 0.259 |
| 0.0187208 | 0.075 |
| 0.0844677 | 0.086 |
| 0.0246886 | 0.078 |
| 0.0693113 | 0.204 |
| 0.0790785 | 0.127 |
| 0.00828256 | 0.025 |
| 0.0621558 | 0.134 |
| 0.0653101 | 0.167 |
| 0.00861881 | 0.2 |
| 0.178273 | 0.659 |
| 0.0438949 | 0.388 |
| 0.0419443 | 0.3 |
| 0.0963196 | 0.102 |
| 0.0121006 | 0.074 |
| 0.0666166 | 0.084 |
| 0.00742865 | 0.121 |
| 0.00690434 | 0.067 |
| 0.0212081 | 0.115 |
| 0.0516271 | 0.072 |
| 0.0242191 | 0.067 |
| 0.145565 | 0.394 |
| 0.170242 | 0.171 |
| 0.157528 | 0.304 |
| 0.448124 | 0.638 |
| 0.0182543 | 0.413 |
| 0.295222 | 0.704 |
| 0.99918 | 0.724 |
| 0.458214 | 0.382 |
| 0.193428 | 0.251 |
| 0.204762 | 0.123 |
| 0.923902 | 0.93 |
| 0.084815 | 0.555 |
| 0.39246 | 0.882 |
| 0.728265 | 0.427 |
| 0.417262 | 0.959 |
| 0.3406 | 0.362 |
| 0.810233 | 0.926 |
| 0.324857 | 0.424 |
| 0.086525 | 0.138 |
| 0.736122 | 0.383 |
| 0.0908533 | 0.367 |
| 0.433534 | 0.642 |
| 0.532516 | 0.615 |
| 0.986874 | 0.943 |
| 0.240312 | 0.128 |
| 0.199518 | 0.31 |
| 0.17959 | 0.404 |
| 0.0424938 | 0.483 |
| 0.132656 | 0.906 |
| 0.118333 | 0.478 |
| 0.496088 | 0.866 |
| 0.477072 | 0.405 |
| 0.440385 | 0.901 |
| 0.563571 | 0.431 |
| 0.011366 | 0.097 |
| 0.059063 | 0.354 |
| 0.0276554 | 0.21 |
| 0.0250466 | 0.198 |
| 0.187957 | 0.24 |
| 0.0830897 | 0.115 |
| 0.0301601 | 0.021 |
| 0.0105289 | 0.05 |
| 0.0163828 | 0.253 |
| 0.0644174 | 0.157 |
| 0.126787 | 0.801 |
| 0.0224719 | 0.308 |
| 0.00490462 | 0.306 |
| 0.112877 | 0.198 |
| 0.0767865 | 0.386 |
| 0.0834902 | 0.06 |
| 0.171273 | 0.202 |
| 0.0160967 | 0.127 |
| 0.0566357 | 0.553 |
| 0.0836146 | 0.127 |
| 0.0846404 | 0.146 |
| 0.0106217 | 0.351 |
| 0.0145284 | 0.273 |
| 0.0123423 | 0.129 |
| 0.0407996 | 0.491 |
| 0.151856 | 0.226 |
| 0.223442 | 0.471 |
| 0.364725 | 0.222 |
| 0.110765 | 0.249 |
| 0.0461888 | 0.215 |
| 0.0171033 | 0.614 |
| 0.0714977 | 0.425 |
| 0.378915 | 0.337 |
| 0.0755547 | 0.575 |
| 0.0468166 | 0.103 |
| 0.0645643 | 0.132 |
| 0.335013 | 0.324 |
| 0.15664 | 0.159 |
| 0.0446142 | 0.618 |
| 0.0661056 | 0.177 |
| 0.0386835 | 0.86 |
| 0.020888 | 0.105 |
| 0.243813 | 0.662 |
| 0.0312266 | 0.319 |
| 0.116142 | 0.307 |
| 0.168989 | 0.621 |
| 0.250176 | 0.672 |
| 0.00775243 | 0.011 |
| 0.0771182 | 0.035 |
| 0.798824 | 0.629 |
| 0.0963236 | 0.247 |
| 0.0614317 | 0.225 |
| 0.724372 | 0.708 |
| 0.453196 | 0.2 |
| 0.0589736 | 0.21 |
| 0.0557552 | 0.108 |
| 0.455322 | 0.719 |
| 0.0670983 | 0.221 |
| 0.263397 | 0.725 |
| 0.0924782 | 0.349 |
| 0.078766 | 0.063 |
| 0.0260028 | 0.076 |
| 0.0081193 | 0.139 |
| 0.0520851 | 0.111 |
| 0.0139322 | 0.003 |
| 0.0223479 | 0.414 |
| 0.0536557 | 0.227 |
| 0.335189 | 0.446 |
| 0.912935 | 0.302 |
| 0.367767 | 0.489 |
| 0.436079 | 0.057 |
| 0.796443 | 0.58 |
| 0.113954 | 0.024 |
| 0.340996 | 0.432 |
| 0.896164 | 0.822 |
| 0.0789581 | 0.325 |
| 0.533718 | 0.174 |
| 0.861754 | 0.089 |
| 0.110051 | 0.038 |
| 0.484344 | 0.115 |
| 0.988302 | 0.687 |
| 1.0 | 0.971 |
| 0.996018 | 0.834 |
| 0.0361723 | 0.193 |
| 0.356055 | 0.325 |
| 0.0182137 | 0.043 |
| 0.118938 | 0.081 |
| 0.0400954 | 0.033 |
| 0.999512 | 0.996 |
| 0.620379 | 0.321 |
| 0.765736 | 0.693 |
| 0.792556 | 0.614 |